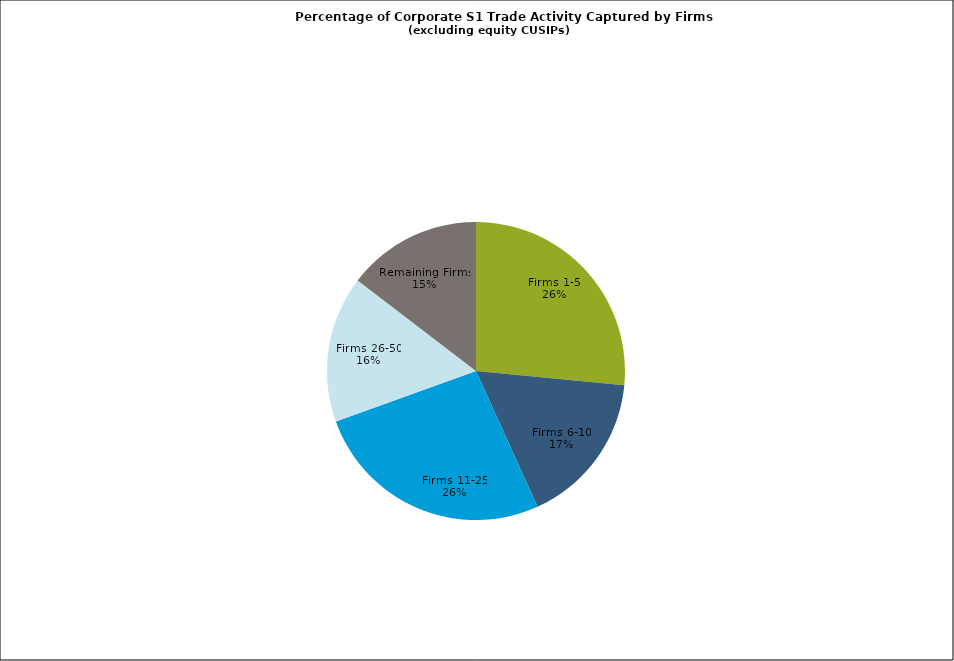
| Category | Series 0 |
|---|---|
| Firms 1-5 | 0.265 |
| Firms 6-10 | 0.167 |
| Firms 11-25 | 0.262 |
| Firms 26-50 | 0.159 |
| Remaining Firms | 0.146 |